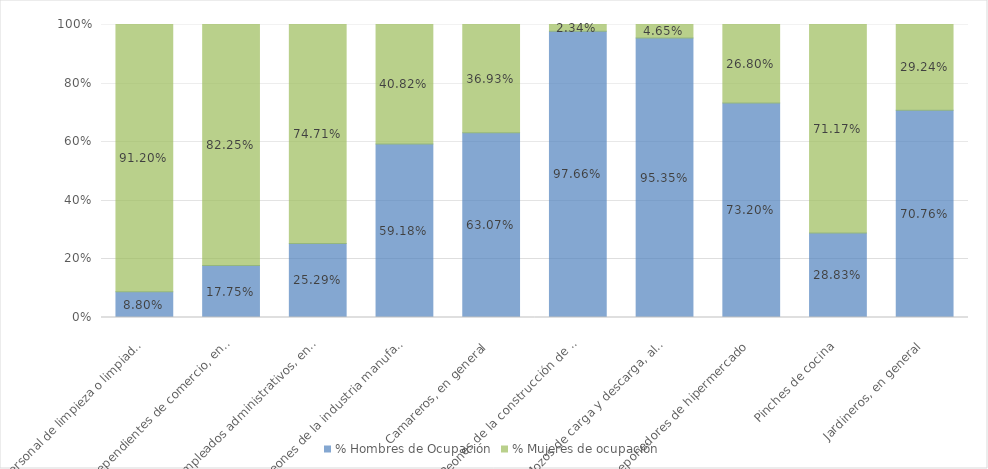
| Category | % Hombres de Ocupación | % Mujeres de ocupación |
|---|---|---|
| Personal de limpieza o limpiadores en general | 0.088 | 0.912 |
| Dependientes de comercio, en general | 0.177 | 0.823 |
| Empleados administrativos, en general | 0.253 | 0.747 |
| Peones de la industria manufacturera, en general | 0.592 | 0.408 |
| Camareros, en general | 0.631 | 0.369 |
| Peones de la construcción de edificios | 0.977 | 0.023 |
| Mozos de carga y descarga, almacén y/o mercado de abastos | 0.954 | 0.046 |
| Reponedores de hipermercado | 0.732 | 0.268 |
| Pinches de cocina | 0.288 | 0.712 |
| Jardineros, en general | 0.708 | 0.292 |